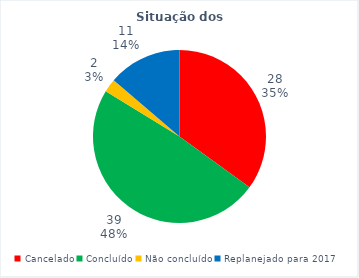
| Category | PROJETOS |
|---|---|
| Cancelado | 28 |
| Concluído | 39 |
| Não concluído | 2 |
| Replanejado para 2017 | 11 |